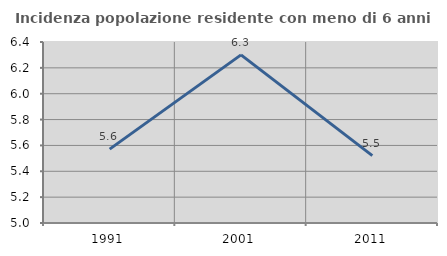
| Category | Incidenza popolazione residente con meno di 6 anni |
|---|---|
| 1991.0 | 5.571 |
| 2001.0 | 6.3 |
| 2011.0 | 5.521 |